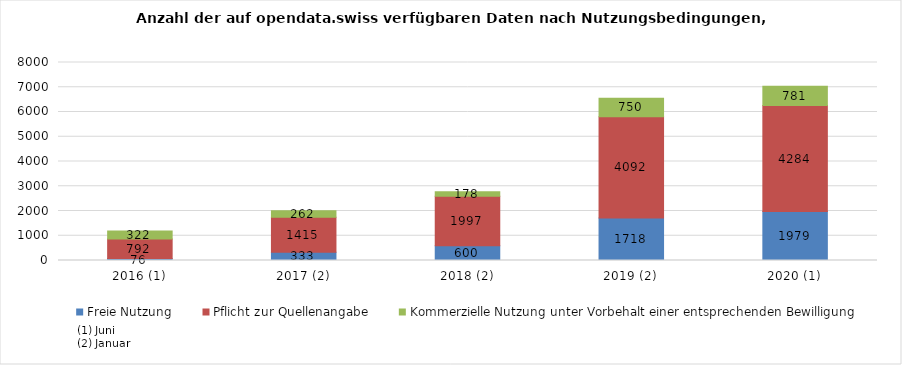
| Category | Freie Nutzung | Pflicht zur Quellenangabe | Kommerzielle Nutzung unter Vorbehalt einer entsprechenden Bewilligung |
|---|---|---|---|
| 2016 (1) | 76 | 792 | 322 |
| 2017 (2) | 333 | 1415 | 262 |
| 2018 (2) | 600 | 1997 | 178 |
| 2019 (2) | 1718 | 4092 | 750 |
| 2020 (1) | 1979 | 4284 | 781 |